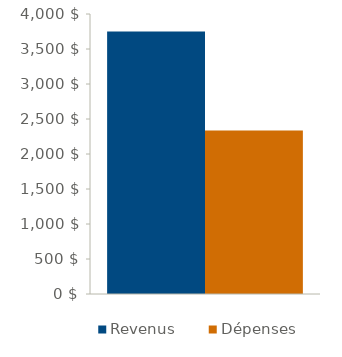
| Category | Revenus | Dépenses |
|---|---|---|
| 0 | 3750 | 2336 |